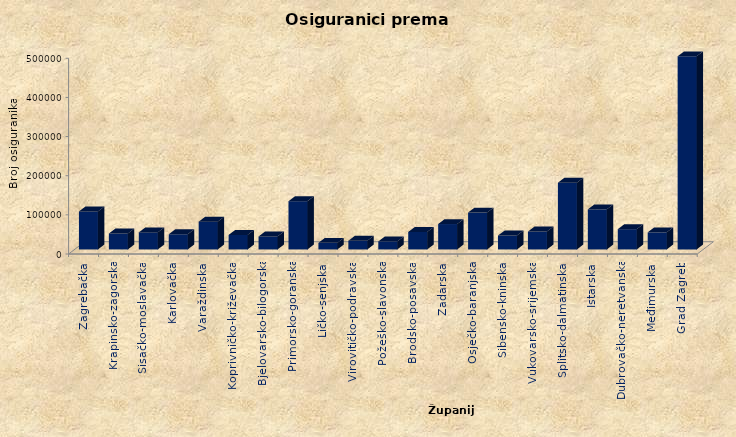
| Category | Series 0 |
|---|---|
| Zagrebačka | 97049 |
| Krapinsko-zagorska | 40749 |
| Sisačko-moslavačka | 43592 |
| Karlovačka | 38838 |
| Varaždinska | 70957 |
| Koprivničko-križevačka | 37090 |
| Bjelovarsko-bilogorska | 33186 |
| Primorsko-goranska | 123265 |
| Ličko-senjska | 16935 |
| Virovitičko-podravska | 22253 |
| Požeško-slavonska | 20424 |
| Brodsko-posavska | 44627 |
| Zadarska | 64933 |
| Osječko-baranjska | 94291 |
| Šibensko-kninska | 35641 |
| Vukovarsko-srijemska | 45814 |
| Splitsko-dalmatinska | 170510 |
| Istarska | 102474 |
| Dubrovačko-neretvanska | 51795 |
| Međimurska | 43727 |
| Grad Zagreb | 493416 |